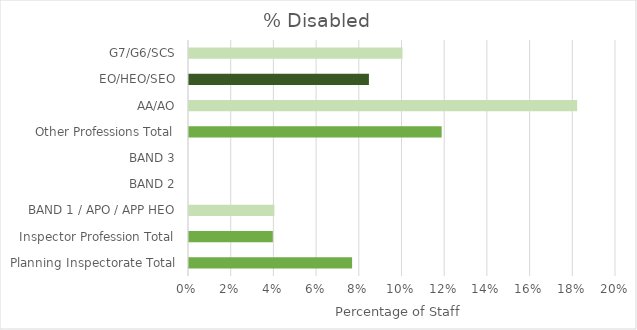
| Category | % Disabled |
|---|---|
| Planning Inspectorate Total | 0.076 |
| Inspector Profession Total | 0.039 |
| BAND 1 / APO / APP HEO | 0.04 |
| BAND 2 | 0 |
| BAND 3 | 0 |
| Other Professions Total | 0.118 |
| AA/AO | 0.182 |
| EO/HEO/SEO | 0.084 |
| G7/G6/SCS | 0.1 |